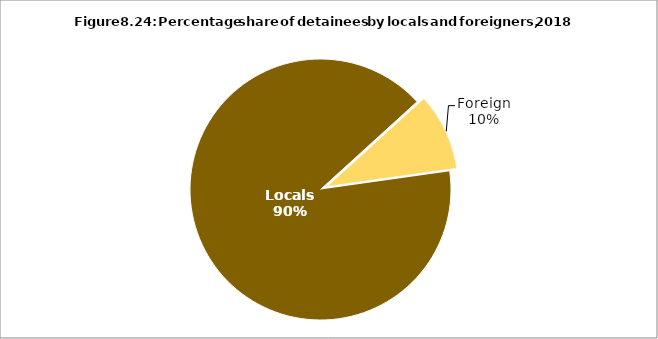
| Category | Series 0 |
|---|---|
| Locals | 2604 |
| Foreign | 274 |